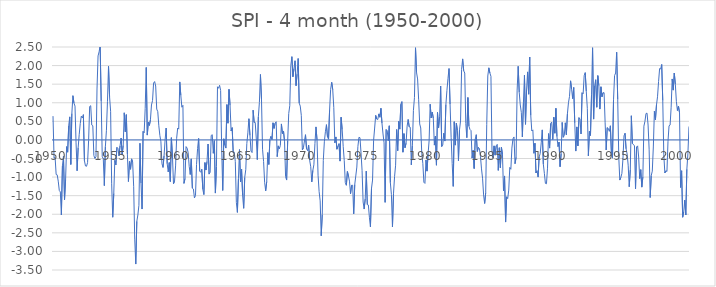
| Category | SPI - 4 month |
|---|---|
| 1950.0 | 0.64 |
| nan | -0.49 |
| nan | -0.47 |
| nan | -0.93 |
| nan | -0.94 |
| nan | -1.11 |
| nan | -1.36 |
| nan | -1.4 |
| nan | -2.02 |
| nan | -0.7 |
| nan | -0.44 |
| nan | -1.61 |
| nan | -1.08 |
| nan | -0.18 |
| nan | -0.33 |
| nan | 0.38 |
| nan | 0.62 |
| nan | -0.66 |
| nan | 0.71 |
| nan | 1.19 |
| nan | 0.99 |
| nan | 0.91 |
| nan | -0.08 |
| nan | -0.83 |
| nan | -0.21 |
| nan | 0.14 |
| nan | 0.44 |
| nan | 0.64 |
| nan | 0.59 |
| nan | 0.68 |
| nan | -0.56 |
| nan | -0.7 |
| nan | -0.71 |
| nan | -0.61 |
| nan | -0.01 |
| nan | 0.9 |
| nan | 0.92 |
| nan | 0.4 |
| nan | 0.38 |
| nan | -0.42 |
| nan | -0.5 |
| nan | -0.45 |
| nan | 1.37 |
| nan | 2.26 |
| nan | 2.37 |
| nan | 2.54 |
| nan | 1.05 |
| nan | -0.45 |
| nan | -0.51 |
| nan | -1.23 |
| nan | -0.18 |
| nan | 0.26 |
| nan | 1.04 |
| nan | 1.98 |
| nan | 1.16 |
| nan | 0.77 |
| nan | -1.18 |
| 1955.0 | -2.08 |
| nan | -1.44 |
| nan | -0.55 |
| nan | -0.67 |
| nan | -0.2 |
| nan | -0.23 |
| nan | -0.43 |
| nan | -0.16 |
| nan | 0.05 |
| nan | -0.4 |
| nan | -0.15 |
| nan | 0.73 |
| nan | 0.22 |
| nan | 0.68 |
| nan | -0.38 |
| nan | -1.12 |
| nan | -0.58 |
| nan | -0.79 |
| nan | -0.51 |
| nan | -0.59 |
| nan | -1.26 |
| nan | -2.67 |
| nan | -3.34 |
| nan | -2.19 |
| nan | -2.02 |
| nan | -1.76 |
| nan | -0.09 |
| nan | -1.16 |
| nan | -1.86 |
| nan | 0.23 |
| nan | 0.19 |
| nan | 0.85 |
| nan | 1.95 |
| nan | 0.13 |
| nan | 0.48 |
| nan | 0.39 |
| nan | 0.54 |
| nan | 0.94 |
| nan | 1.06 |
| nan | 1.53 |
| nan | 1.57 |
| nan | 1.45 |
| nan | 0.83 |
| nan | 0.76 |
| nan | 0.38 |
| nan | 0.12 |
| nan | -0.05 |
| nan | -0.64 |
| nan | -0.74 |
| nan | -0.43 |
| nan | 0 |
| nan | 0.32 |
| nan | -0.64 |
| nan | -0.86 |
| nan | -0.61 |
| nan | -1.12 |
| nan | 0.06 |
| nan | -0.43 |
| nan | -1.18 |
| nan | -1.11 |
| 1960.0 | -0.7 |
| nan | 0.04 |
| nan | 0.32 |
| nan | 0.29 |
| nan | 1.56 |
| nan | 1.2 |
| nan | 0.88 |
| nan | 0.93 |
| nan | -1.17 |
| nan | -1.04 |
| nan | -0.18 |
| nan | -0.22 |
| nan | -0.34 |
| nan | -0.71 |
| nan | -0.93 |
| nan | -0.51 |
| nan | -1.3 |
| nan | -1.32 |
| nan | -1.56 |
| nan | -1.5 |
| nan | -0.66 |
| nan | -0.23 |
| nan | 0.04 |
| nan | -0.84 |
| nan | -0.87 |
| nan | -0.79 |
| nan | -1.33 |
| nan | -1.47 |
| nan | -0.61 |
| nan | -0.81 |
| nan | -0.58 |
| nan | -0.11 |
| nan | -0.92 |
| nan | -0.87 |
| nan | 0.12 |
| nan | 0.14 |
| nan | -0.36 |
| nan | -0.02 |
| nan | -1.43 |
| nan | -0.72 |
| nan | 1.43 |
| nan | 1.39 |
| nan | 1.47 |
| nan | 1.33 |
| nan | -0.22 |
| nan | -1.36 |
| nan | 0.03 |
| nan | -0.14 |
| nan | -0.22 |
| nan | 0.95 |
| nan | 0.45 |
| nan | 1.36 |
| nan | 0.93 |
| nan | 0.24 |
| nan | 0.33 |
| nan | -0.34 |
| nan | -0.33 |
| nan | -0.58 |
| nan | -1.68 |
| nan | -1.95 |
| 1965.0 | -1.04 |
| nan | -0.26 |
| nan | -1.13 |
| nan | -0.79 |
| nan | -1.5 |
| nan | -1.84 |
| nan | -1.01 |
| nan | -0.8 |
| nan | -0.1 |
| nan | 0.19 |
| nan | 0.57 |
| nan | 0.12 |
| nan | -0.3 |
| nan | -0.34 |
| nan | 0.8 |
| nan | 0.47 |
| nan | 0.47 |
| nan | 0.05 |
| nan | -0.53 |
| nan | 0.62 |
| nan | 1.01 |
| nan | 1.76 |
| nan | 1.1 |
| nan | -0.25 |
| nan | -0.58 |
| nan | -1.14 |
| nan | -1.37 |
| nan | -1.12 |
| nan | -0.34 |
| nan | -0.66 |
| nan | 0 |
| nan | 0.1 |
| nan | 0.01 |
| nan | 0.46 |
| nan | 0.31 |
| nan | 0.45 |
| nan | 0.49 |
| nan | -0.45 |
| nan | -0.16 |
| nan | -0.24 |
| nan | -0.15 |
| nan | 0.43 |
| nan | 0.17 |
| nan | 0.24 |
| nan | -0.04 |
| nan | -0.99 |
| nan | -1.08 |
| nan | -0.02 |
| nan | 0.71 |
| nan | 0.92 |
| nan | 2 |
| nan | 2.24 |
| nan | 1.7 |
| nan | 1.92 |
| nan | 2.13 |
| nan | 1.46 |
| nan | 1.77 |
| nan | 2.19 |
| nan | 0.99 |
| nan | 0.91 |
| 1970.0 | 0.66 |
| nan | -0.27 |
| nan | -0.21 |
| nan | -0.03 |
| nan | 0.14 |
| nan | -0.24 |
| nan | -0.29 |
| nan | -0.14 |
| nan | -0.55 |
| nan | -0.72 |
| nan | -1.13 |
| nan | -0.82 |
| nan | -0.67 |
| nan | -0.1 |
| nan | 0.35 |
| nan | 0 |
| nan | -0.95 |
| nan | -1.39 |
| nan | -1.64 |
| nan | -2.58 |
| nan | -2.01 |
| nan | -0.55 |
| nan | -0.05 |
| nan | 0.22 |
| nan | 0.41 |
| nan | 0.08 |
| nan | 0.02 |
| nan | 0.8 |
| nan | 1.36 |
| nan | 1.55 |
| nan | 1.35 |
| nan | 0.87 |
| nan | -0.08 |
| nan | 0.08 |
| nan | -0.25 |
| nan | -0.17 |
| nan | -0.1 |
| nan | -0.57 |
| nan | 0.61 |
| nan | 0.28 |
| nan | -0.18 |
| nan | -0.56 |
| nan | -1.15 |
| nan | -1.22 |
| nan | -0.85 |
| nan | -0.97 |
| nan | -1.11 |
| nan | -1.45 |
| nan | -1.22 |
| nan | -1.22 |
| nan | -1.99 |
| nan | -1.2 |
| nan | -0.97 |
| nan | -0.73 |
| nan | -0.18 |
| nan | 0.07 |
| nan | 0.06 |
| nan | -0.35 |
| nan | -0.82 |
| nan | -1.67 |
| 1975.0 | -1.86 |
| nan | -1.59 |
| nan | -0.84 |
| nan | -1.74 |
| nan | -1.75 |
| nan | -2.08 |
| nan | -2.34 |
| nan | -1.3 |
| nan | -1.08 |
| nan | -0.01 |
| nan | 0.32 |
| nan | 0.66 |
| nan | 0.56 |
| nan | 0.55 |
| nan | 0.7 |
| nan | 0.61 |
| nan | 0.85 |
| nan | 0.45 |
| nan | 0.16 |
| nan | -0.08 |
| nan | -1.68 |
| nan | 0.28 |
| nan | 0.25 |
| nan | -0.02 |
| nan | 0.38 |
| nan | -1.15 |
| nan | -1.47 |
| nan | -2.34 |
| nan | -1.44 |
| nan | -0.99 |
| nan | -0.68 |
| nan | 0.28 |
| nan | -0.29 |
| nan | 0.5 |
| nan | 0.29 |
| nan | 0.96 |
| nan | 1.03 |
| nan | -0.33 |
| nan | 0.17 |
| nan | -0.21 |
| nan | -0.09 |
| nan | 0.37 |
| nan | 0.55 |
| nan | 0.35 |
| nan | 0.34 |
| nan | -0.67 |
| nan | -0.16 |
| nan | 0.79 |
| nan | 1.14 |
| nan | 2.48 |
| nan | 1.81 |
| nan | 1.64 |
| nan | 1.08 |
| nan | 0.43 |
| nan | 0.32 |
| nan | -0.37 |
| nan | -0.63 |
| nan | -1.14 |
| nan | -1.17 |
| nan | -0.54 |
| 1980.0 | -0.84 |
| nan | -0.38 |
| nan | -0.02 |
| nan | 0.96 |
| nan | 0.59 |
| nan | 0.75 |
| nan | 0.58 |
| nan | -0.14 |
| nan | 0.1 |
| nan | -0.68 |
| nan | 0.74 |
| nan | 0.32 |
| nan | 0.62 |
| nan | 1.45 |
| nan | -0.18 |
| nan | -0.14 |
| nan | 0.18 |
| nan | -0.03 |
| nan | 0.95 |
| nan | 1.33 |
| nan | 1.65 |
| nan | 1.92 |
| nan | 0.96 |
| nan | 0.07 |
| nan | -0.63 |
| nan | -1.25 |
| nan | 0.49 |
| nan | -0.14 |
| nan | 0.45 |
| nan | 0.25 |
| nan | -0.56 |
| nan | 0.27 |
| nan | 0.51 |
| nan | 1.9 |
| nan | 2.18 |
| nan | 1.86 |
| nan | 1.8 |
| nan | 0.44 |
| nan | 0.06 |
| nan | 1.14 |
| nan | 0.37 |
| nan | 0.28 |
| nan | 0.25 |
| nan | -0.49 |
| nan | -0.28 |
| nan | -0.77 |
| nan | 0.02 |
| nan | 0.14 |
| nan | -0.31 |
| nan | -0.2 |
| nan | -0.23 |
| nan | -0.44 |
| nan | -0.78 |
| nan | -1.03 |
| nan | -1.48 |
| nan | -1.71 |
| nan | -1.42 |
| nan | 0.42 |
| nan | 1.72 |
| nan | 1.94 |
| 1985.0 | 1.8 |
| nan | 1.71 |
| nan | -0.3 |
| nan | -0.48 |
| nan | -0.16 |
| nan | -0.41 |
| nan | -0.16 |
| nan | -0.12 |
| nan | -0.82 |
| nan | -0.21 |
| nan | -0.75 |
| nan | -0.2 |
| nan | -0.38 |
| nan | -1.37 |
| nan | -0.97 |
| nan | -2.21 |
| nan | -1.53 |
| nan | -1.58 |
| nan | -1.35 |
| nan | -0.74 |
| nan | -0.79 |
| nan | -0.22 |
| nan | 0.03 |
| nan | 0.08 |
| nan | -0.64 |
| nan | -0.47 |
| nan | 1.34 |
| nan | 1.98 |
| nan | 1.28 |
| nan | 0.94 |
| nan | 0.74 |
| nan | 0.08 |
| nan | 0.99 |
| nan | 1.74 |
| nan | 0.42 |
| nan | 1.34 |
| nan | 1.83 |
| nan | 1.23 |
| nan | 2.23 |
| nan | 0.66 |
| nan | 0.24 |
| nan | 0.27 |
| nan | -0.36 |
| nan | -0.09 |
| nan | -0.89 |
| nan | -0.83 |
| nan | -1 |
| nan | -0.46 |
| nan | -0.37 |
| nan | -0.08 |
| nan | 0.27 |
| nan | -0.65 |
| nan | -0.9 |
| nan | -1.17 |
| nan | -1.18 |
| nan | -0.76 |
| nan | 0.17 |
| nan | -0.22 |
| nan | 0.44 |
| nan | 0.48 |
| 1990.0 | 0.01 |
| nan | 0.61 |
| nan | 0.18 |
| nan | 0.85 |
| nan | 0.09 |
| nan | -0.18 |
| nan | -0.06 |
| nan | -0.72 |
| nan | -0.38 |
| nan | 0.47 |
| nan | 0.07 |
| nan | 0.12 |
| nan | 0.46 |
| nan | 0.14 |
| nan | 0.7 |
| nan | 1 |
| nan | 1.17 |
| nan | 1.59 |
| nan | 1.36 |
| nan | 1.11 |
| nan | 1.41 |
| nan | 0.46 |
| nan | -0.3 |
| nan | 0.35 |
| nan | -0.16 |
| nan | 0.6 |
| nan | 0.56 |
| nan | 0.16 |
| nan | 1.27 |
| nan | 1.24 |
| nan | 1.73 |
| nan | 1.81 |
| nan | 1.31 |
| nan | 0.85 |
| nan | -0.43 |
| nan | 0.23 |
| nan | 0.12 |
| nan | 1.21 |
| nan | 2.48 |
| nan | 0.56 |
| nan | 1.46 |
| nan | 1.62 |
| nan | 0.88 |
| nan | 1.73 |
| nan | 1.46 |
| nan | 0.83 |
| nan | 1.43 |
| nan | 1.16 |
| nan | 1.27 |
| nan | 1.27 |
| nan | 0.46 |
| nan | -0.27 |
| nan | 0.33 |
| nan | 0.31 |
| nan | 0.23 |
| nan | 0.38 |
| nan | -0.37 |
| nan | -0.49 |
| nan | 1.08 |
| nan | 1.73 |
| 1995.0 | 1.8 |
| nan | 2.36 |
| nan | 1.09 |
| nan | -0.45 |
| nan | -1.08 |
| nan | -1.01 |
| nan | -0.9 |
| nan | -0.51 |
| nan | 0.11 |
| nan | 0.18 |
| nan | -0.24 |
| nan | -0.38 |
| nan | -0.68 |
| nan | -1.26 |
| nan | -0.81 |
| nan | 0.65 |
| nan | -0.1 |
| nan | -0.12 |
| nan | -0.16 |
| nan | -1.32 |
| nan | -0.19 |
| nan | -0.16 |
| nan | -0.46 |
| nan | -1.04 |
| nan | -0.8 |
| nan | -1.27 |
| nan | -1 |
| nan | 0.37 |
| nan | 0.5 |
| nan | 0.71 |
| nan | 0.72 |
| nan | 0.4 |
| nan | -0.25 |
| nan | -1.55 |
| nan | -0.96 |
| nan | -0.84 |
| nan | -0.19 |
| nan | 0.77 |
| nan | 0.54 |
| nan | 0.94 |
| nan | 1.16 |
| nan | 1.57 |
| nan | 1.92 |
| nan | 1.91 |
| nan | 2.03 |
| nan | 1.06 |
| nan | -0.4 |
| nan | -0.89 |
| nan | -0.83 |
| nan | -0.85 |
| nan | -0.04 |
| nan | 0.38 |
| nan | 0.4 |
| nan | 0.88 |
| nan | 1.64 |
| nan | 1.34 |
| nan | 1.8 |
| nan | 1.5 |
| nan | 1.03 |
| nan | 0.79 |
| 2000.0 | 0.91 |
| nan | 0.73 |
| nan | -1.28 |
| nan | -0.83 |
| nan | -2.08 |
| nan | -1.94 |
| nan | -1.62 |
| nan | -2.02 |
| nan | -0.79 |
| nan | -0.37 |
| nan | 0.34 |
| nan | 0.41 |